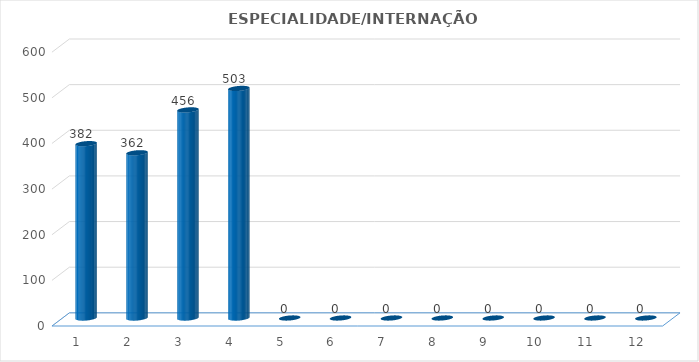
| Category | Series 0 |
|---|---|
| 0 | 382 |
| 1 | 362 |
| 2 | 456 |
| 3 | 503 |
| 4 | 0 |
| 5 | 0 |
| 6 | 0 |
| 7 | 0 |
| 8 | 0 |
| 9 | 0 |
| 10 | 0 |
| 11 | 0 |